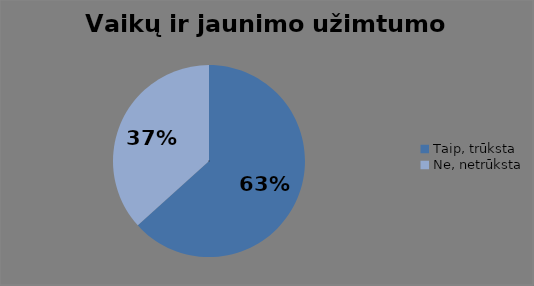
| Category | Series 0 |
|---|---|
| Taip, trūksta | 69 |
| Ne, netrūksta | 40 |